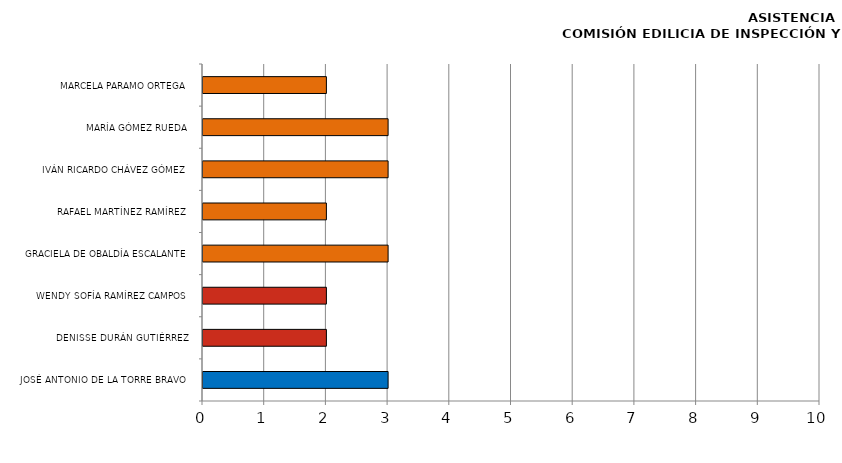
| Category | Series 0 |
|---|---|
| JOSÉ ANTONIO DE LA TORRE BRAVO | 3 |
| DENISSE DURÁN GUTIÉRREZ | 2 |
| WENDY SOFÍA RAMÍREZ CAMPOS | 2 |
| GRACIELA DE OBALDÍA ESCALANTE | 3 |
| RAFAEL MARTÍNEZ RAMÍREZ | 2 |
| IVÁN RICARDO CHÁVEZ GÓMEZ | 3 |
| MARÍA GÓMEZ RUEDA | 3 |
| MARCELA PARAMO ORTEGA | 2 |